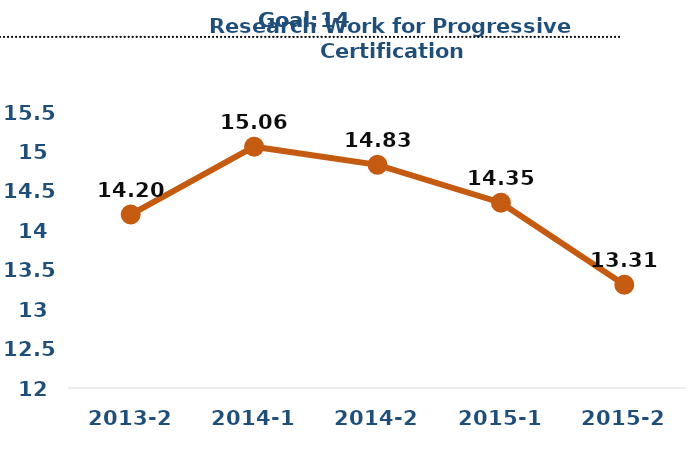
| Category | Series 0 |
|---|---|
| 2013-2 | 14.2 |
| 2014-1 | 15.06 |
| 2014-2 | 14.83 |
| 2015-1 | 14.35 |
| 2015-2 | 13.31 |